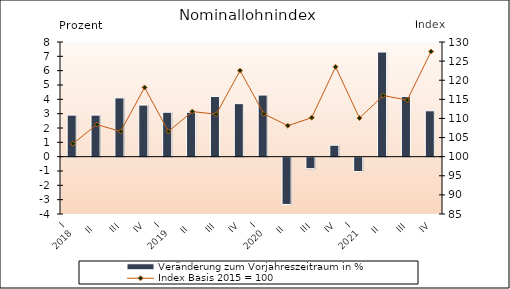
| Category | Veränderung zum Vorjahreszeitraum in % |
|---|---|
| 0 | 2.9 |
| 1 | 2.9 |
| 2 | 4.1 |
| 3 | 3.6 |
| 4 | 3.1 |
| 5 | 3.1 |
| 6 | 4.2 |
| 7 | 3.7 |
| 8 | 4.3 |
| 9 | -3.3 |
| 10 | -0.8 |
| 11 | 0.8 |
| 12 | -1 |
| 13 | 7.3 |
| 14 | 4.2 |
| 15 | 3.2 |